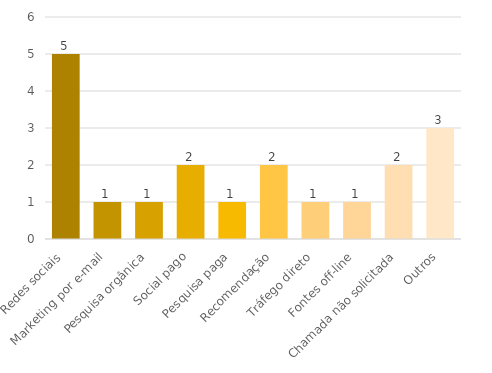
| Category | Series 0 |
|---|---|
| Redes sociais | 5 |
| Marketing por e-mail | 1 |
| Pesquisa orgânica | 1 |
| Social pago | 2 |
| Pesquisa paga | 1 |
| Recomendação | 2 |
| Tráfego direto | 1 |
| Fontes off-line | 1 |
| Chamada não solicitada | 2 |
| Outros | 3 |